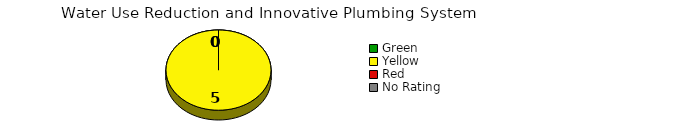
| Category | Counts |
|---|---|
| Green | 0 |
| Yellow | 5 |
| Red | 0 |
| No Rating | 0 |